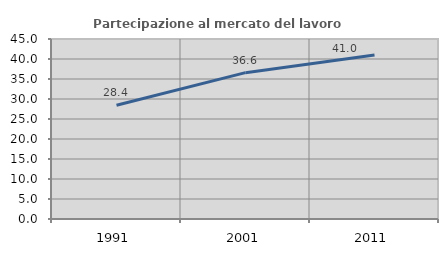
| Category | Partecipazione al mercato del lavoro  femminile |
|---|---|
| 1991.0 | 28.426 |
| 2001.0 | 36.585 |
| 2011.0 | 40.984 |